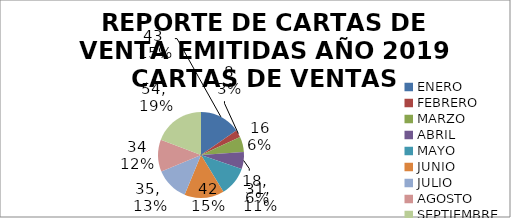
| Category | REPORTE DE CARTAS DE VENTA EMITIDAS AÑO 2019 CARTAS DE VENTAS EMITIDAS |
|---|---|
| ENERO | 43 |
| FEBRERO | 8 |
| MARZO | 16 |
| ABRIL | 18 |
| MAYO | 31 |
| JUNIO | 42 |
| JULIO | 35 |
| AGOSTO | 34 |
| SEPTIEMBRE | 54 |